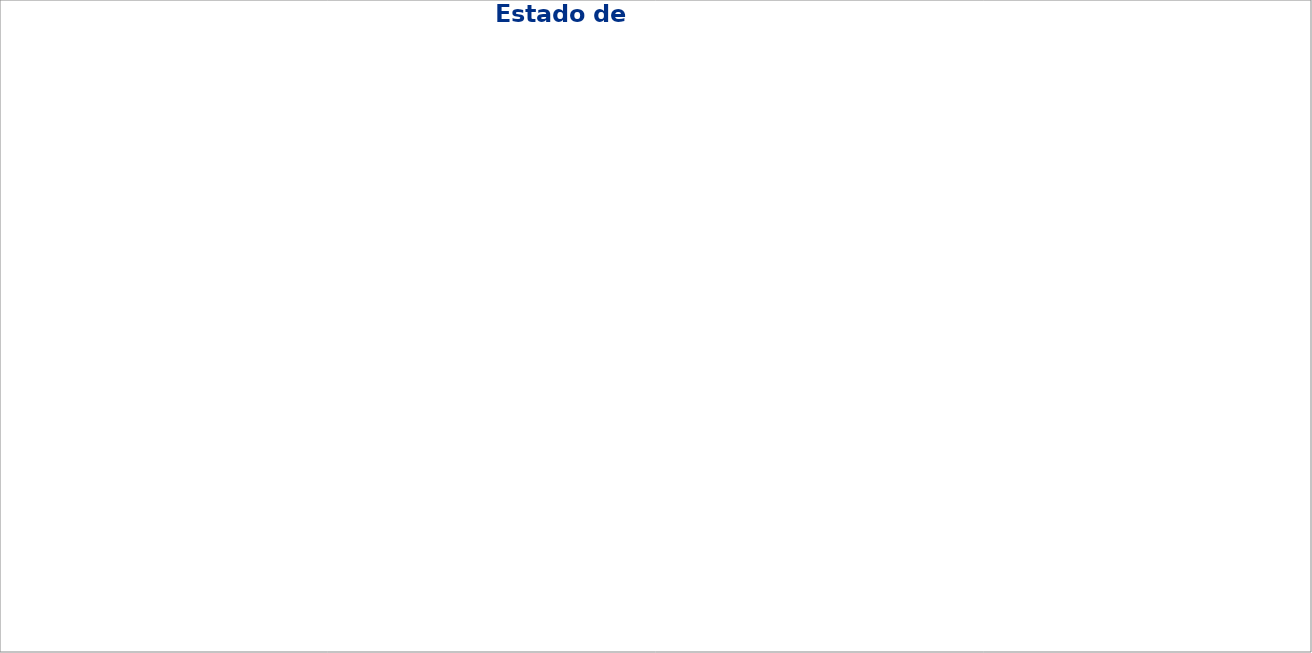
| Category | Series 1 |
|---|---|
| 4.  REQUISITOS GENERALES | 0 |
| 4.1 Imparcialidad | 0 |
| 4.2 Confidencialidad | 0 |
| 4.3 Requisitos relativos a los pacientes  | 0 |
| 5. REQUISITOS ESTRUCTURALES Y DE GOBERNANZA | 0 |
| 5.1. Entidad legal | 0 |
| 5.2. Director del Laboratorio | 0 |
| 5.3. Actividades del laboratorio | 0 |
| 5.4 Estructura y autoridad | 0 |
| 5.5 Objetivos y políticas | 0 |
| 5.6 Gestión del riesgo | 0 |
| 6. REQUISITOS DE LOS RECURSOS | 0 |
| 6.2 Personal | 0 |
| 6.3 Instalaciones y condiciones ambientales | 0 |
| 6.4 Equipamiento | 0 |
| 6.5 Calibración y trazabilidad metrológica de equipamiento | 0 |
| 6.6 Reactivos y materiales consumibles | 0 |
| 6.7 Acuerdos de prestación de servicios | 0 |
| 6.8 Productos y servicios proporcionados externamente | 0 |
| 7. REQUISITOS DEL PROCESO | 0 |
| 7.1 Generalidades | 0 |
| 7.2 Procesos preanalíticos | 0 |
| 7.3 Procesos analíticos o de análisis | 0 |
| 7.4 Procesos postanalíticos | 0 |
| 7.5 Trabajo no conforme | 0 |
| 7.6 Control de datos y gestión de la información (G-ENAC-24) | 0 |
| 7.7 Quejas | 0 |
| 7.8 Planificación de la continuidad y preparación para emergencias | 0 |
| 8.  REQUISITOS DEL SISTEMA DE GESTIÓN | 0 |
| 8.1 Requisitos generales | 0 |
| 8.2 Documentación del sistema de gestión | 0 |
| 8.3 Control de documentos del sistema de gestión | 0 |
| 8.4 Control de registros | 0 |
| 8.5 Acciones para abordar riesgos y oportunidades de mejora | 0 |
| 8.6 Mejora | 0 |
| 8.7 No conformidades y acciones correctivas | 0 |
| 8.8 Evaluaciones | 0 |
| 8.9. Revisiones por la dirección | 0 |
| ANEXO A (NORMATIVO). REQUISITOS ADICIONALES PARA LOS ANÁLISIS REALIZADOS CERCA DEL PACIENTE (POCT) | 0 |